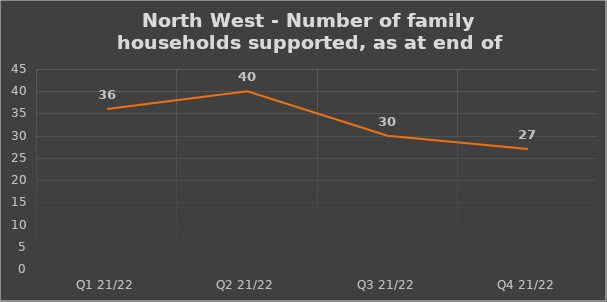
| Category | Number of financially supported households at end of quarter |
|---|---|
| Q1 21/22 | 36 |
| Q2 21/22 | 40 |
| Q3 21/22 | 30 |
| Q4 21/22 | 27 |